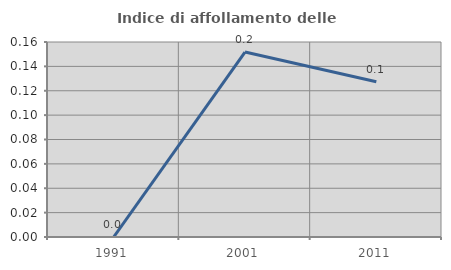
| Category | Indice di affollamento delle abitazioni  |
|---|---|
| 1991.0 | 0 |
| 2001.0 | 0.152 |
| 2011.0 | 0.127 |